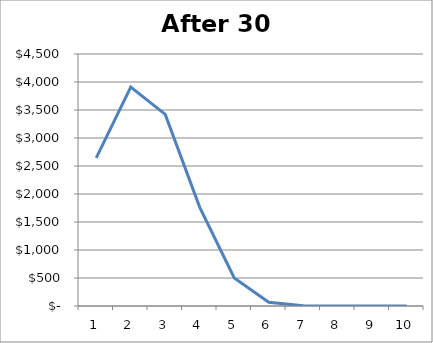
| Category | Series 0 |
|---|---|
| 0 | 2643.474 |
| 1 | 3909.69 |
| 2 | 3420.979 |
| 3 | 1762.316 |
| 4 | 500 |
| 5 | 66.806 |
| 6 | 3.018 |
| 7 | 0.021 |
| 8 | 0 |
| 9 | 0 |